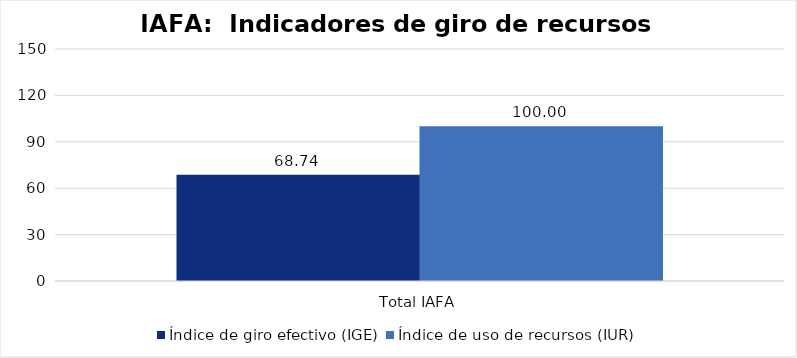
| Category | Índice de giro efectivo (IGE) | Índice de uso de recursos (IUR)  |
|---|---|---|
| Total IAFA | 68.744 | 100 |